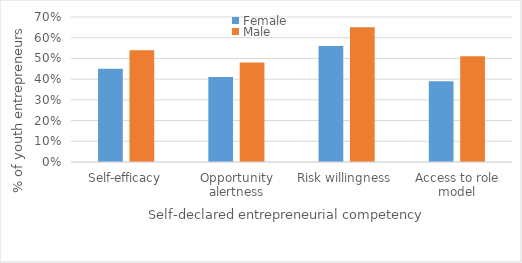
| Category | Female | Male |
|---|---|---|
| Self-efficacy | 0.45 | 0.54 |
| Opportunity alertness | 0.41 | 0.48 |
| Risk willingness | 0.56 | 0.65 |
| Access to role model | 0.39 | 0.51 |